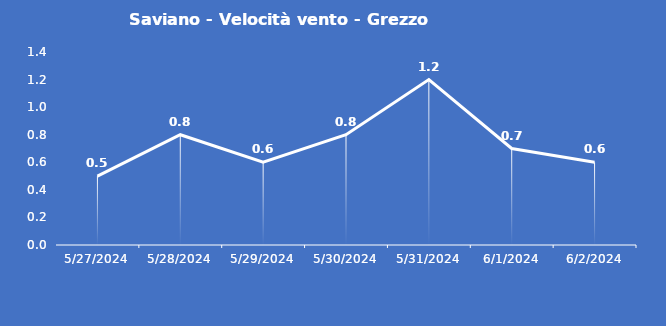
| Category | Saviano - Velocità vento - Grezzo (m/s) |
|---|---|
| 5/27/24 | 0.5 |
| 5/28/24 | 0.8 |
| 5/29/24 | 0.6 |
| 5/30/24 | 0.8 |
| 5/31/24 | 1.2 |
| 6/1/24 | 0.7 |
| 6/2/24 | 0.6 |